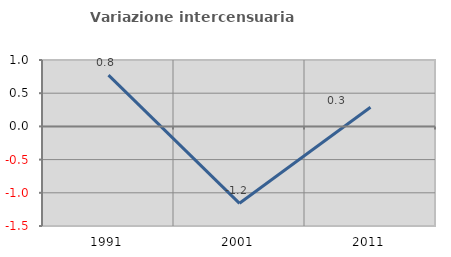
| Category | Variazione intercensuaria annua |
|---|---|
| 1991.0 | 0.772 |
| 2001.0 | -1.159 |
| 2011.0 | 0.288 |